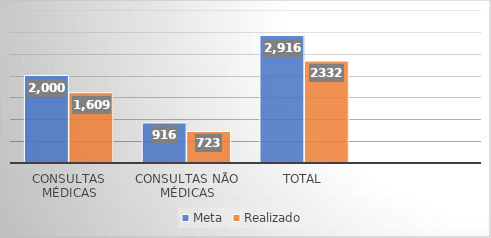
| Category | Meta | Realizado |
|---|---|---|
| Consultas Médicas | 2000 | 1609 |
| Consultas não médicas | 916 | 723 |
| Total | 2916 | 2332 |